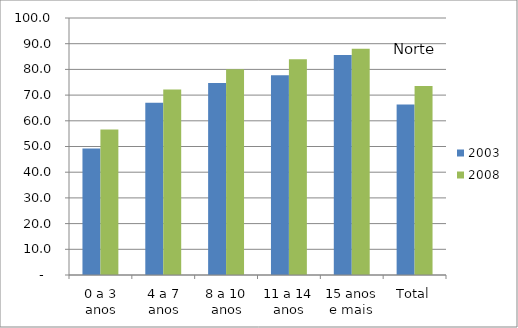
| Category | 2003 | 2008 |
|---|---|---|
| 0 a 3 anos | 49.21 | 56.58 |
| 4 a 7 anos | 67 | 72.17 |
| 8 a 10 anos | 74.67 | 80.08 |
| 11 a 14 anos | 77.7 | 83.97 |
| 15 anos e mais | 85.63 | 88.02 |
| Total | 66.32 | 73.52 |